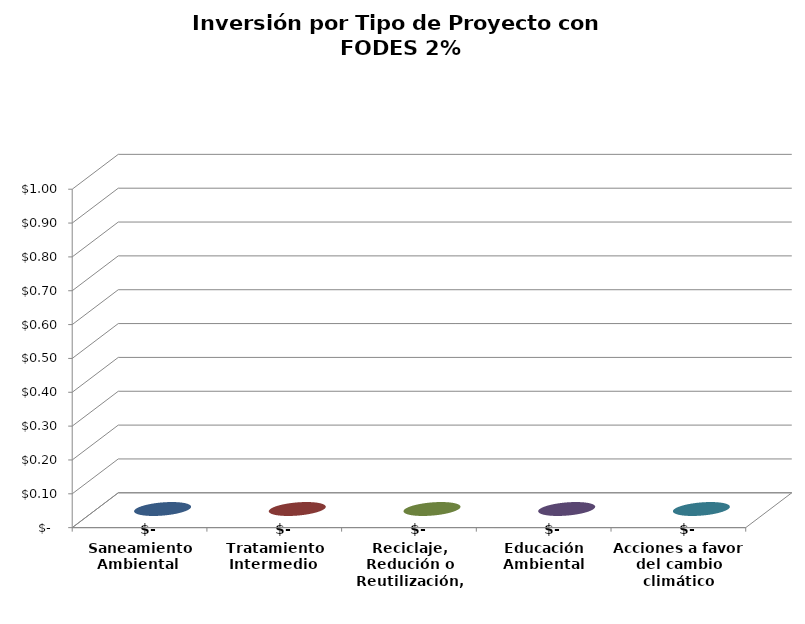
| Category | Series 0 |
|---|---|
| Saneamiento Ambiental  | 0 |
| Tratamiento Intermedio  | 0 |
| Reciclaje, Redución o Reutilización, entre otros. | 0 |
| Educación Ambiental | 0 |
| Acciones a favor del cambio climático | 0 |